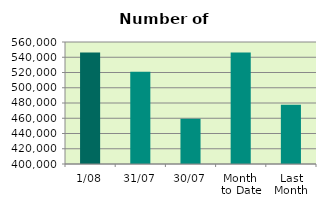
| Category | Series 0 |
|---|---|
| 1/08 | 546384 |
| 31/07 | 521010 |
| 30/07 | 459314 |
| Month 
to Date | 546384 |
| Last
Month | 477777.545 |